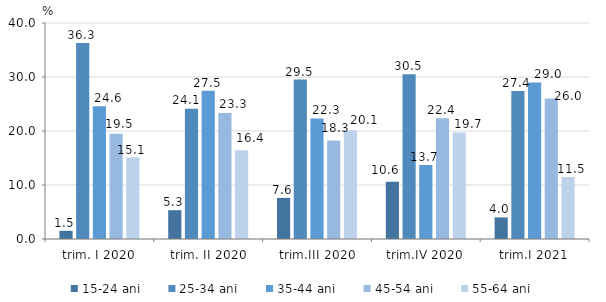
| Category | 15-24 ani | 25-34 ani | 35-44 ani | 45-54 ani | 55-64 ani |
|---|---|---|---|---|---|
| trim. I 2020 | 1.513 | 36.279 | 24.587 | 19.493 | 15.08 |
| trim. II 2020 | 5.332 | 24.113 | 27.474 | 23.314 | 16.429 |
| trim.III 2020 | 7.608 | 29.529 | 22.325 | 18.264 | 20.099 |
| trim.IV 2020 | 10.607 | 30.502 | 13.688 | 22.379 | 19.717 |
| trim.I 2021 | 4 | 27.4 | 29 | 26 | 11.5 |